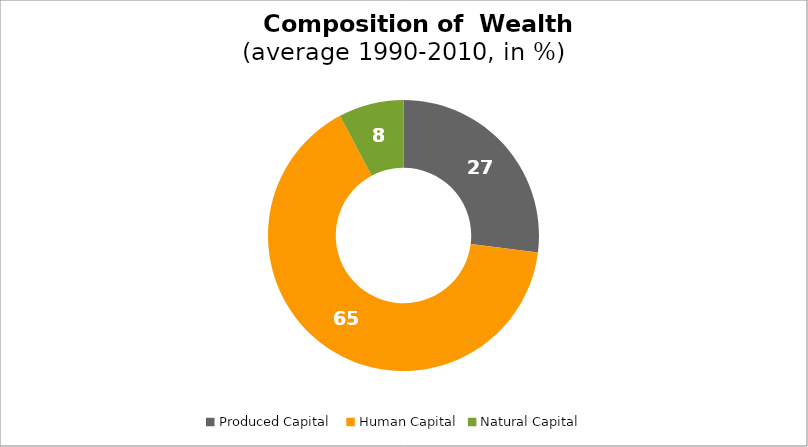
| Category | Series 0 |
|---|---|
| Produced Capital  | 26.988 |
| Human Capital | 65.247 |
| Natural Capital | 7.765 |